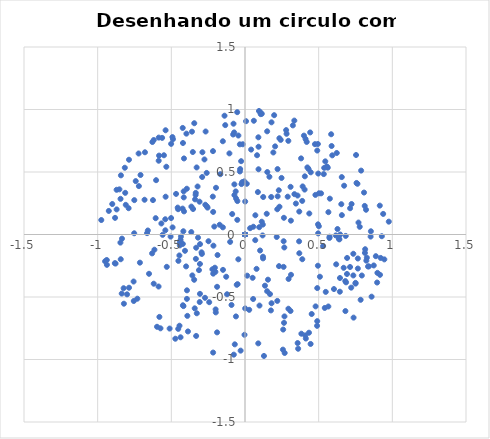
| Category | Y dentro do Circulo |
|---|---|
| 0.2941494130794362 | 0.749 |
| 0.5414493482163687 | -0.588 |
| 0.0 | 0 |
| 0.0 | 0 |
| 0.5660289205656317 | 0.179 |
| -0.2671827902955777 | 0.824 |
| 0.3671700671999589 | -0.055 |
| 0.8987338431680711 | -0.307 |
| -0.6790496207109624 | 0.658 |
| 0.0 | 0 |
| 0.9457393925962683 | -0.199 |
| -0.4373616848154729 | -0.043 |
| -0.07798164039639421 | 0.886 |
| 0.23072688172821088 | -0.253 |
| 0.0 | 0 |
| 0.0 | 0 |
| 0.04167682645095594 | 0.679 |
| 0.5013568381594551 | 0.066 |
| 0.2946855053844022 | -0.594 |
| 0.7658177464501605 | -0.192 |
| -0.31884595823467743 | -0.025 |
| 0.6163008782579018 | -0.007 |
| -0.5589206364381119 | -0.003 |
| 0.4748370309225174 | 0.723 |
| 0.6922112292820968 | -0.316 |
| -0.43473672491951443 | -0.016 |
| 0.6858875232697872 | -0.383 |
| 0.5923150215027637 | 0.633 |
| 0.49559760242313455 | 0.081 |
| 0.5759438931337597 | 0.287 |
| 0.0 | 0 |
| 0.05641747083701021 | 0.062 |
| 0.5304703597563405 | -0.092 |
| 0.8079325371352861 | 0.336 |
| -0.2948543363129059 | -0.143 |
| -0.32188102782502304 | 0.384 |
| 0.0901054042940097 | -0.871 |
| -0.5389449371655033 | 0.834 |
| 0.5347108882758353 | 0.483 |
| 0.5848068977406009 | 0.802 |
| 0.0 | 0 |
| 0.24796686821780445 | 0.453 |
| 0.36860751882657894 | -0.15 |
| 0.0 | 0 |
| -0.4072869910445944 | -0.13 |
| 0.0 | 0 |
| 0.007054451618637048 | 0.906 |
| 0.0 | 0 |
| -0.3270904979770859 | -0.63 |
| 0.22936429356155363 | 0.354 |
| 0.0 | 0 |
| 0.1514140917897564 | 0.5 |
| -0.5406096847180217 | 0.034 |
| 0.7131013687680712 | -0.26 |
| -0.9244185582309628 | 0.188 |
| -0.8004876663058214 | -0.479 |
| 0.0 | 0 |
| 0.0 | 0 |
| -0.2161044862942112 | 0.181 |
| 0.0 | 0 |
| -0.8714737017085814 | 0.358 |
| 0.0 | 0 |
| -0.2084166517363104 | 0.063 |
| 0.9287063329001071 | -0.014 |
| 0.0 | 0 |
| 0.6836709033454063 | -0.011 |
| -0.10577644653767404 | 0.649 |
| -0.7132605972327757 | -0.225 |
| 0.0013785702516131426 | 0.264 |
| -0.8833312912085758 | -0.229 |
| 0.5738703648616248 | -0.018 |
| 0.7928659448768893 | -0.328 |
| 0.3573833167143916 | -0.868 |
| 0.2693691020571214 | -0.948 |
| 0.0 | 0 |
| 0.33480268678534086 | 0.911 |
| 0.3355167295967101 | 0.323 |
| 0.0702704360791937 | 0.154 |
| -0.7415804376125115 | 0.427 |
| -0.8819305192997813 | 0.133 |
| 0.0 | 0 |
| 0.0 | 0 |
| 0.49452638566962714 | 0.724 |
| 0.0 | 0 |
| 0.6699284308734952 | -0.266 |
| -0.35735726047236915 | -0.327 |
| 0.1780601958300121 | 0.3 |
| -0.5015936511686496 | 0.132 |
| -0.0033845683994755404 | -0.802 |
| -0.3281288050563784 | 0.536 |
| 0.5878899123216339 | 0.708 |
| -0.03274545779325022 | 0.524 |
| -0.8523883184804628 | 0.361 |
| -0.06931753221383197 | -0.879 |
| 0.12866613361052592 | -0.972 |
| -0.8219231337582773 | -0.554 |
| -0.10080917151735447 | -0.059 |
| 0.8407396339160662 | -0.255 |
| 0.31146610487606696 | 0.111 |
| -0.5676426134254695 | 0.088 |
| 0.7633102596971277 | 0.406 |
| 0.028574259294429805 | -0.603 |
| -0.5866596318878008 | -0.416 |
| 0.0 | 0 |
| 0.011979607241968226 | 0.406 |
| 0.7351104742186261 | -0.154 |
| -0.15044991178704636 | 0.746 |
| -0.07210795115514634 | 0.401 |
| 0.0 | 0 |
| 0.14744043795579986 | 0.166 |
| -0.5012336067100376 | 0.725 |
| -0.17204240914324886 | 0.078 |
| 0.8126387245789706 | 0.229 |
| -0.13899645886734602 | 0.95 |
| 0.736997108781061 | -0.665 |
| 0.0 | 0 |
| 0.43133307587631275 | 0.524 |
| 0.0012385483504593342 | -0.591 |
| 0.0 | 0 |
| 0.0 | 0 |
| -0.3997298236667757 | -0.255 |
| 0.38062238974700024 | 0.609 |
| 0.6815513358850109 | -0.612 |
| 0.2044713037266217 | 0.705 |
| -0.35416771838566063 | 0.66 |
| 0.0 | 0 |
| 0.0 | 0 |
| 0.0 | 0 |
| -0.8157605110711752 | 0.534 |
| -0.8421113068447197 | 0.473 |
| 0.434208232194895 | -0.786 |
| 0.49657766488010324 | 0.009 |
| 0.49040131870418535 | -0.429 |
| -0.7547878223694957 | -0.532 |
| 0.23393698745245328 | 0.222 |
| 0.29575547337516417 | -0.356 |
| 0.4526375677129286 | -0.636 |
| -0.7874529708112661 | 0.598 |
| -0.41844732509718696 | 0.026 |
| -0.36460715351106354 | 0.019 |
| 0.0 | 0 |
| -0.004711407466996942 | 0.425 |
| -0.8366640728620827 | -0.472 |
| 0.3453342777184427 | 0.248 |
| -0.6305666209458503 | -0.151 |
| 0.5163394727606188 | 0.329 |
| 0.0 | 0 |
| 0.6574568843754054 | 0.155 |
| -0.2589509817931628 | 0.225 |
| -0.5858090166204573 | 0.59 |
| -0.06147509578301569 | -0.655 |
| 0.12212526202574092 | -0.178 |
| 0.4046856789335114 | 0.359 |
| 0.0 | 0 |
| -0.029614888024345642 | -0.929 |
| 0.06951572874897383 | -0.045 |
| -0.4210857373163681 | 0.732 |
| 0.0 | 0 |
| -0.4531974818429354 | -0.755 |
| 0.2209677186046446 | 0.523 |
| 0.0983100606133942 | -0.568 |
| -0.8349275044207383 | -0.033 |
| 0.9378113821919136 | 0.165 |
| -0.29065566617032124 | 0.46 |
| 0.7659377112046553 | -0.272 |
| -0.2928155157093091 | -0.156 |
| 0.219049707893598 | 0.202 |
| -0.18957813863346806 | -0.783 |
| 0.6568446798789043 | 0.459 |
| 0.23333163008629998 | 0.77 |
| -0.14936066871321763 | -0.283 |
| 0.0553566992657597 | -0.516 |
| 0.4095257327356905 | -0.807 |
| 0.0 | 0 |
| -0.2598987013655405 | 0.493 |
| -0.07342639757615865 | 0.817 |
| 0.0 | 0 |
| -0.4446067214718925 | -0.73 |
| -0.3058007101448552 | -0.236 |
| -0.3351724174825075 | 0.317 |
| -0.16742701348701794 | 0.483 |
| -0.2692857283388703 | 0.238 |
| 0.6437812750708298 | -0.458 |
| 0.7881913678978303 | 0.511 |
| 0.1978693567442289 | 0.955 |
| -0.46787237360164413 | 0.325 |
| 0.38878532589503423 | -0.198 |
| 0.8967410030158152 | -0.384 |
| -0.44539266880183526 | -0.168 |
| 0.4902682691923286 | -0.693 |
| 0.5084637023227156 | -0.338 |
| -0.6647255493049915 | 0.011 |
| 0.0 | 0 |
| -0.4567885995501002 | 0.215 |
| 0.5656676650799637 | -0.576 |
| 0.0 | 0 |
| 0.0 | 0 |
| 0.09175033486806217 | 0.522 |
| -0.8091956248623642 | 0.237 |
| -0.044956538631860665 | 0.792 |
| 0.09659416664685039 | 0.058 |
| 0.32480664033373285 | 0.873 |
| -0.05281644905485927 | 0.979 |
| -0.5856328510474915 | 0.775 |
| 0.11381467846516635 | 0.102 |
| 0.0 | 0 |
| 0.1504218978563865 | 0.825 |
| -0.3443556614001748 | 0.89 |
| -0.7561492785144592 | -0.376 |
| -0.6193630913185058 | 0.756 |
| 0.26784705592783653 | -0.655 |
| 0.41285736701166953 | -0.832 |
| -0.5049326166747421 | -0.017 |
| 0.0 | 0 |
| -0.7872159740249809 | -0.426 |
| 0.5449583491771164 | 0.585 |
| -0.060482224239664095 | 0.288 |
| -0.8239061912474623 | -0.43 |
| -0.3872533731981853 | -0.775 |
| -0.659441917833709 | 0.032 |
| -0.4161126555911392 | 0.345 |
| -0.8712022629372183 | 0.201 |
| 0.0 | 0 |
| 0.35685539159960067 | 0.312 |
| 0.7503142433664463 | -0.393 |
| -0.2213612156217939 | -0.279 |
| 0.2898021834848481 | 0.302 |
| 0.4364266611400045 | 0.168 |
| -0.550189377908965 | 0.634 |
| -0.05165452222863265 | 0.267 |
| 0.11394104110349312 | 0.966 |
| -0.20087763147829008 | -0.299 |
| -0.20435672306786912 | -0.266 |
| -0.5626055963799041 | 0.773 |
| -0.07190155389811381 | 0.315 |
| -0.541217755216683 | 0.122 |
| 0.44638941227204154 | 0.497 |
| 0.8270604397528845 | -0.186 |
| -0.05599529070161968 | -0.402 |
| -0.39422526611958375 | -0.515 |
| 0.0 | 0 |
| 0.2648904651487871 | -0.707 |
| 0.0 | 0 |
| -0.5339331442394069 | 0.542 |
| 0.0 | 0 |
| 0.2153554116039187 | -0.02 |
| 0.4062158769240998 | 0.465 |
| -0.06307819646508706 | 0.345 |
| 0.0 | 0 |
| 0.41103777309896117 | 0.764 |
| 0.0 | 0 |
| 0.720841257033328 | -0.425 |
| -0.1983188927238242 | -0.623 |
| 0.0 | 0 |
| 0.6277978374705198 | 0.044 |
| 0.0 | 0 |
| 0.8237057517691786 | -0.209 |
| -0.8433332293289701 | -0.198 |
| 0.0 | 0 |
| 0.30908383606617296 | -0.612 |
| 0.7786659293482008 | 0.062 |
| -0.4227001667323189 | 0.853 |
| -0.07598765835515509 | -0.961 |
| -0.18941257382971477 | -0.418 |
| -0.8447515357196853 | 0.285 |
| 0.6930337091831447 | -0.188 |
| -0.6033378375986787 | 0.435 |
| -0.42144481548381085 | -0.566 |
| -0.7520456727357983 | 0.01 |
| 0.6464385775638337 | 0 |
| 0.2821801345041932 | 0.806 |
| 0.0 | 0 |
| 0.0 | 0 |
| -0.49263664742340296 | 0.779 |
| -0.4176769739682664 | -0.573 |
| 0.0 | 0 |
| -0.47288639768549623 | -0.834 |
| -0.09156903607088784 | -0.564 |
| -0.44229344665169323 | -0.087 |
| 0.0 | 0 |
| 0.5731714208878256 | -0.028 |
| -0.9753771909443314 | 0.116 |
| 0.0 | 0 |
| 0.08189144584670993 | 0.634 |
| -0.3342093444684098 | 0.333 |
| 0.2592216435234116 | -0.76 |
| -0.42201738440349024 | -0.075 |
| 0.821627093574828 | 0.198 |
| -0.08046514692905538 | 0.8 |
| -0.8455943444698235 | -0.065 |
| 0.0 | 0 |
| -0.3938768236338488 | -0.447 |
| 0.4778114201472372 | 0.317 |
| 0.19234402082711788 | 0.656 |
| 0.10240375269366742 | -0.128 |
| 0.12257927327912155 | -0.191 |
| -0.9381952695860551 | -0.204 |
| -0.511511367703344 | -0.753 |
| 0.21922985988034438 | -0.531 |
| -0.1967385770812935 | 0.374 |
| -0.4539777623047363 | 0.202 |
| -0.05225063448173528 | 0.117 |
| 0.0 | 0 |
| -0.7203235962750827 | 0.387 |
| -0.3913691376804662 | -0.651 |
| -0.21730980118497745 | 0.667 |
| -0.9496401387413953 | -0.214 |
| 0.10533228398069872 | 0.976 |
| 0.3094316002870161 | 0.381 |
| -0.2429258943304493 | -0.542 |
| 0.6374323181789967 | -0.035 |
| 0.09072592424952841 | 0.778 |
| 0.0 | 0 |
| 0.7570584339500899 | 0.412 |
| -0.3074132073632121 | -0.54 |
| 0.815559440663715 | -0.118 |
| -0.3977081859478442 | 0.807 |
| 0.9210097549444058 | -0.187 |
| -0.0240348924454985 | 0.403 |
| -0.709031973372122 | 0.476 |
| 0.753770455226993 | 0.636 |
| -0.8784229830823524 | -0.232 |
| 0.9163054736085285 | -0.323 |
| 0.034615231132977264 | 0.05 |
| -0.30563791663767503 | -0.475 |
| 0.41883171214721426 | 0.741 |
| 0.0 | 0 |
| -0.7512849654586728 | 0.275 |
| 0.26410019026283216 | 0.134 |
| 0.0 | 0 |
| 0.6037756476743443 | -0.436 |
| 0.4971961594902168 | 0.488 |
| 0.0 | 0 |
| 0.7503727482676967 | -0.387 |
| -0.30524600071414554 | -0.077 |
| -0.03458534732362262 | 0.504 |
| 0.3883459816459238 | 0.269 |
| 0.0 | 0 |
| 0.16954768220129757 | -0.477 |
| 0.6807283333832903 | -0.373 |
| 0.0 | 0 |
| 0.17989804761668826 | 0.897 |
| -0.41391218159735477 | 0.185 |
| -0.6245971266471622 | 0.275 |
| -0.05001515490723096 | -0.397 |
| -0.3315570744716385 | -0.812 |
| -0.3334998466834087 | -0.195 |
| -0.01921618772712219 | 0.419 |
| -0.28906393667412833 | 0.658 |
| 0.014877917608587587 | -0.329 |
| -0.6194725528276466 | -0.394 |
| 0.07850686597029055 | -0.275 |
| -0.2184956490752008 | 0.303 |
| 0.05184904878807406 | -0.347 |
| 0.0 | 0 |
| -0.3086625337576392 | 0.262 |
| 0.0 | 0 |
| 0.0 | 0 |
| 0.0 | 0 |
| 0.0 | 0 |
| -0.12195393944669375 | -0.478 |
| -0.5810268533431346 | -0.659 |
| 0.5020343807622802 | 0.33 |
| 0.0 | 0 |
| -0.21638783584373278 | -0.944 |
| -0.5736716533731709 | -0.751 |
| 0.2792862064149584 | 0.835 |
| 0.7133571340892131 | 0.21 |
| -0.25409796572310817 | 0.215 |
| -0.7307349971489903 | -0.514 |
| 0.48917168337572803 | -0.731 |
| 0.0 | 0 |
| 0.15035554024018105 | -0.454 |
| 0.0 | 0 |
| -0.4423253312877615 | -0.063 |
| -0.18627887583635183 | -0.164 |
| 0.6189715561525269 | -0.239 |
| 0.49482288420416976 | -0.25 |
| -0.6062920085346954 | 0.131 |
| 0.0 | 0 |
| -0.08695678541452079 | 0.164 |
| 0.6536869394214835 | 0.242 |
| 0.0 | 0 |
| -0.42345883730791 | 0.207 |
| 0.4791887944509694 | -0.575 |
| 0.10692245682878876 | 0.963 |
| -0.2713820056760301 | -0.506 |
| 0.25732831102535747 | -0.921 |
| -0.414195963027274 | 0.608 |
| -0.6817491785638523 | 0.278 |
| -0.5309255858875341 | -0.259 |
| 0.7848931802978591 | -0.522 |
| 0.0 | 0 |
| 0.1656633676340582 | 0.462 |
| -0.27521666416519075 | 0.6 |
| 0.4452984991581257 | -0.876 |
| 0.31229447643765895 | -0.322 |
| 0.8526620707244446 | -0.017 |
| 0.0 | 0 |
| 0.120911949233244 | 0.079 |
| 0.0 | 0 |
| -0.7898846540723561 | 0.21 |
| 0.09498089007938226 | 0.988 |
| -0.45212648153748125 | -0.211 |
| -0.2142989899994634 | -0.089 |
| -0.36393311037800347 | 0.223 |
| -0.3947948746115848 | 0.366 |
| -0.3450562603723746 | -0.362 |
| 0.24240685836413878 | 0.757 |
| -0.43743871678284996 | -0.822 |
| -0.13409749823450956 | 0.875 |
| -0.04520706253266793 | -0.199 |
| -0.5387170462136568 | 0.302 |
| 0.11933012092379891 | -0.007 |
| 0.4424538805957918 | 0.816 |
| -0.9373312928435256 | -0.243 |
| 0.0 | 0 |
| 0.2217424722789041 | 0.305 |
| -0.5970945080387049 | -0.738 |
| 0.0 | 0 |
| 0.5617900857890357 | 0.535 |
| 0.0 | 0 |
| 0.0 | 0 |
| 0.7703385925887207 | 0.096 |
| 0.914782554201983 | 0.231 |
| 0.2619961410795002 | -0.259 |
| -0.3124004132279312 | -0.285 |
| 0.12355464894359769 | 0.3 |
| 0.36067092215484853 | -0.914 |
| -0.3525272499901342 | 0.204 |
| -0.35983573079048226 | 0.823 |
| 0.555375052503482 | 0.544 |
| 0.0 | 0 |
| 0.0 | 0 |
| 0.1559659592366014 | -0.361 |
| 0.6727354762739677 | 0.39 |
| 0.13539976865727898 | -0.41 |
| 0.09194236020621638 | 0.702 |
| 0.8739481440438344 | -0.248 |
| -0.415792827133979 | 0.297 |
| 0.0 | 0 |
| 0.5480849815031552 | -0.459 |
| -0.3390231728982276 | 0.281 |
| 0.8881016248729545 | -0.173 |
| -0.48901955681000087 | 0.763 |
| 0.3683603293461637 | 0.184 |
| 0.39130291033523856 | 0.385 |
| 0.0 | 0 |
| 0.0 | 0 |
| -0.3412335878561945 | -0.591 |
| -0.33142036821618337 | -0.106 |
| -0.24774985133552963 | -0.054 |
| -0.19933146764901366 | -0.599 |
| -0.6286156477165876 | 0.74 |
| 0.8592584247133572 | -0.497 |
| 0.060062359162696755 | 0.91 |
| -0.813017856069753 | 0.333 |
| 0.5376184223803071 | 0.533 |
| 0.4233945213108252 | 0.537 |
| 0.0 | 0 |
| -0.026247942163679427 | 0.587 |
| 0.49043519238349487 | 0.672 |
| 0.0 | 0 |
| 0.0 | 0 |
| 0.26232034835065776 | -0.054 |
| 0.1757833512568363 | -0.607 |
| 0.6445899306957517 | -0.348 |
| 0.0 | 0 |
| -0.015051968187147935 | 0.722 |
| 0.0 | 0 |
| -0.21576475292940822 | -0.313 |
| 0.38258901671004986 | -0.794 |
| 0.2667851325578272 | -0.104 |
| -0.6147112086339728 | -0.122 |
| 0.0 | 0 |
| 0.18019257025230462 | -0.55 |
| 0.8139833151670484 | -0.147 |
| -0.1501728292073916 | 0.057 |
| 0.08745172829828407 | 0.339 |
| 0.7233449576578788 | 0.244 |
| 0.8350865673631684 | -0.256 |
| -0.6514155188442963 | -0.314 |
| -0.491514281056904 | 0.057 |
| 0.0 | 0 |
| -0.12765911965725785 | -0.338 |
| 0.0 | 0 |
| 0.0 | 0 |
| 0.9759847556318069 | 0.103 |
| 0.6407330919358296 | -0.039 |
| -0.7220575590229785 | 0.648 |
| 0.4000098486260033 | 0.791 |
| 0.7352700066627915 | -0.327 |
| 0.8544199835552748 | 0.026 |
| -0.03492205523372194 | 0.721 |
| 0.0 | 0 |
| -0.9009471524532204 | 0.244 |
| 0.6228250597333644 | 0.652 |
| -0.5833203608974658 | 0.631 |